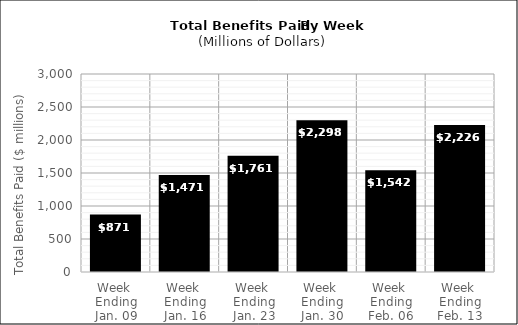
| Category | Series 0 |
|---|---|
| Week 
Ending
Jan. 09 | 870.792 |
| Week 
Ending
Jan. 16 | 1471.018 |
| Week 
Ending
Jan. 23 | 1761.237 |
| Week 
Ending
Jan. 30 | 2297.677 |
| Week 
Ending
Feb. 06 | 1542.463 |
| Week 
Ending
Feb. 13 | 2226.435 |